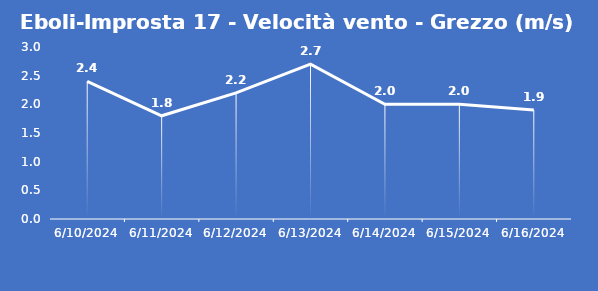
| Category | Eboli-Improsta 17 - Velocità vento - Grezzo (m/s) |
|---|---|
| 6/10/24 | 2.4 |
| 6/11/24 | 1.8 |
| 6/12/24 | 2.2 |
| 6/13/24 | 2.7 |
| 6/14/24 | 2 |
| 6/15/24 | 2 |
| 6/16/24 | 1.9 |